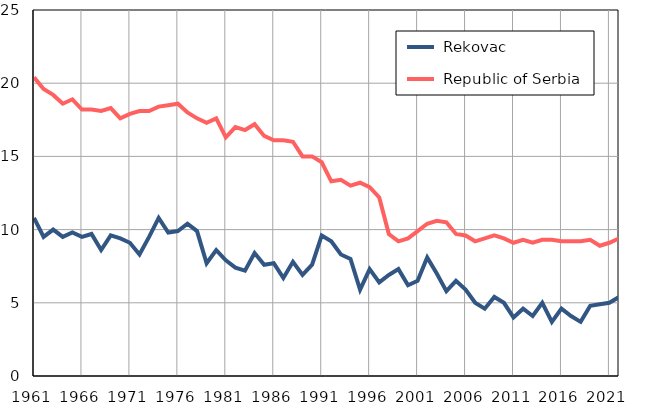
| Category |  Rekovac |  Republic of Serbia |
|---|---|---|
| 1961.0 | 10.8 | 20.4 |
| 1962.0 | 9.5 | 19.6 |
| 1963.0 | 10 | 19.2 |
| 1964.0 | 9.5 | 18.6 |
| 1965.0 | 9.8 | 18.9 |
| 1966.0 | 9.5 | 18.2 |
| 1967.0 | 9.7 | 18.2 |
| 1968.0 | 8.6 | 18.1 |
| 1969.0 | 9.6 | 18.3 |
| 1970.0 | 9.4 | 17.6 |
| 1971.0 | 9.1 | 17.9 |
| 1972.0 | 8.3 | 18.1 |
| 1973.0 | 9.5 | 18.1 |
| 1974.0 | 10.8 | 18.4 |
| 1975.0 | 9.8 | 18.5 |
| 1976.0 | 9.9 | 18.6 |
| 1977.0 | 10.4 | 18 |
| 1978.0 | 9.9 | 17.6 |
| 1979.0 | 7.7 | 17.3 |
| 1980.0 | 8.6 | 17.6 |
| 1981.0 | 7.9 | 16.3 |
| 1982.0 | 7.4 | 17 |
| 1983.0 | 7.2 | 16.8 |
| 1984.0 | 8.4 | 17.2 |
| 1985.0 | 7.6 | 16.4 |
| 1986.0 | 7.7 | 16.1 |
| 1987.0 | 6.7 | 16.1 |
| 1988.0 | 7.8 | 16 |
| 1989.0 | 6.9 | 15 |
| 1990.0 | 7.6 | 15 |
| 1991.0 | 9.6 | 14.6 |
| 1992.0 | 9.2 | 13.3 |
| 1993.0 | 8.3 | 13.4 |
| 1994.0 | 8 | 13 |
| 1995.0 | 5.9 | 13.2 |
| 1996.0 | 7.3 | 12.9 |
| 1997.0 | 6.4 | 12.2 |
| 1998.0 | 6.9 | 9.7 |
| 1999.0 | 7.3 | 9.2 |
| 2000.0 | 6.2 | 9.4 |
| 2001.0 | 6.5 | 9.9 |
| 2002.0 | 8.1 | 10.4 |
| 2003.0 | 7 | 10.6 |
| 2004.0 | 5.8 | 10.5 |
| 2005.0 | 6.5 | 9.7 |
| 2006.0 | 5.9 | 9.6 |
| 2007.0 | 5 | 9.2 |
| 2008.0 | 4.6 | 9.4 |
| 2009.0 | 5.4 | 9.6 |
| 2010.0 | 5 | 9.4 |
| 2011.0 | 4 | 9.1 |
| 2012.0 | 4.6 | 9.3 |
| 2013.0 | 4.1 | 9.1 |
| 2014.0 | 5 | 9.3 |
| 2015.0 | 3.7 | 9.3 |
| 2016.0 | 4.6 | 9.2 |
| 2017.0 | 4.1 | 9.2 |
| 2018.0 | 3.7 | 9.2 |
| 2019.0 | 4.8 | 9.3 |
| 2020.0 | 4.9 | 8.9 |
| 2021.0 | 5 | 9.1 |
| 2022.0 | 5.4 | 9.4 |